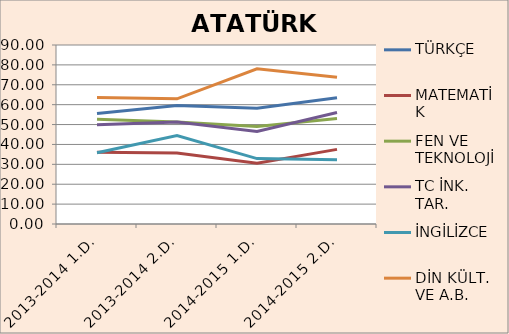
| Category | TÜRKÇE | MATEMATİK | FEN VE TEKNOLOJİ | TC İNK. TAR. | İNGİLİZCE | DİN KÜLT. VE A.B. |
|---|---|---|---|---|---|---|
| 2013-2014 1.D. | 55.56 | 36.03 | 52.69 | 49.94 | 35.86 | 63.64 |
| 2013-2014 2.D. | 59.57 | 35.73 | 51.28 | 51.34 | 44.51 | 62.93 |
| 2014-2015 1.D. | 58.2 | 30.6 | 49.07 | 46.57 | 32.88 | 78.07 |
| 2014-2015 2.D. | 63.49 | 37.53 | 53.01 | 56.03 | 32.29 | 73.77 |